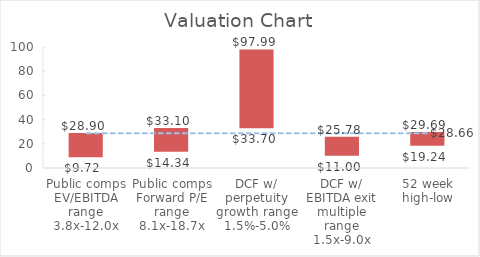
| Category | Series 0 | Series 1 | Series 2 | Series 3 | Series 4 |
|---|---|---|---|---|---|
| Public comps EV/EBITDA range 3.8x-12.0x |  |  | 9.719 | 19.178 | 28.897 |
| Public comps Forward P/E range 8.1x-18.7x |  |  | 14.337 | 18.762 | 33.099 |
| DCF w/ perpetuity growth range 1.5%-5.0% |  |  | 33.695 | 64.298 | 97.994 |
| DCF w/ EBITDA exit multiple range 1.5x-9.0x |  |  | 11.002 | 14.782 | 25.784 |
| 52 week high-low |  |  | 19.24 | 10.45 | 29.69 |